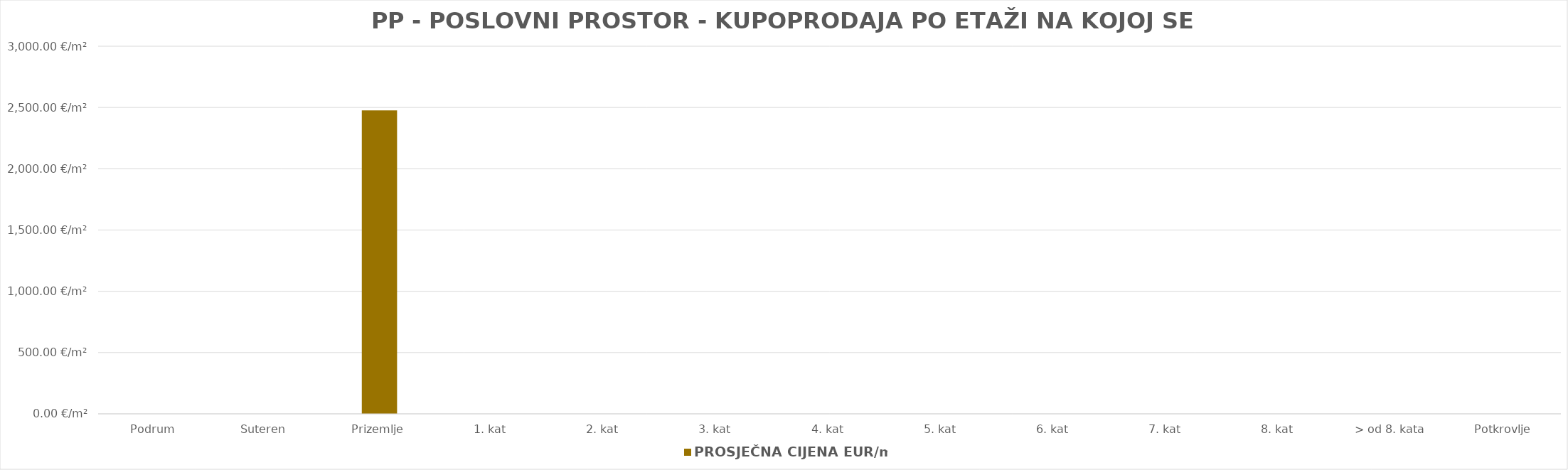
| Category | PROSJEČNA CIJENA EUR/m2 |
|---|---|
| Podrum | 0 |
| Suteren  | 0 |
| Prizemlje | 1906-10-11 21:47:26 |
| 1. kat | 0 |
| 2. kat | 0 |
| 3. kat | 0 |
| 4. kat | 0 |
| 5. kat | 0 |
| 6. kat | 0 |
| 7. kat | 0 |
| 8. kat | 0 |
| > od 8. kata | 0 |
| Potkrovlje | 0 |